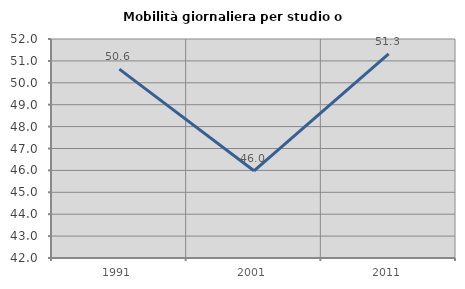
| Category | Mobilità giornaliera per studio o lavoro |
|---|---|
| 1991.0 | 50.623 |
| 2001.0 | 45.983 |
| 2011.0 | 51.326 |